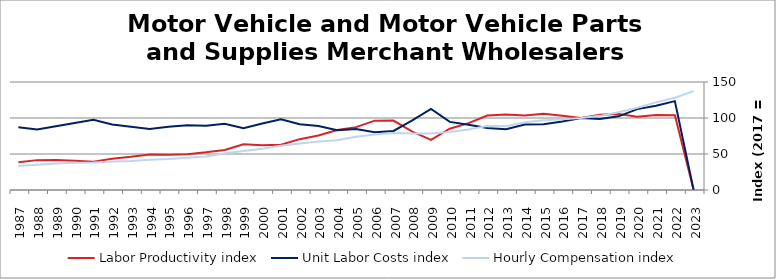
| Category | Labor Productivity index | Unit Labor Costs index | Hourly Compensation index |
|---|---|---|---|
| 2023.0 | 0 | 0 | 137.307 |
| 2022.0 | 103.831 | 123.4 | 128.127 |
| 2021.0 | 104.025 | 116.959 | 121.667 |
| 2020.0 | 101.749 | 112.314 | 114.278 |
| 2019.0 | 105.544 | 102.301 | 107.973 |
| 2018.0 | 104.469 | 98.562 | 102.967 |
| 2017.0 | 100 | 100 | 100 |
| 2016.0 | 103.191 | 95.053 | 98.087 |
| 2015.0 | 105.77 | 91.439 | 96.715 |
| 2014.0 | 103.376 | 90.913 | 93.982 |
| 2013.0 | 104.828 | 84.533 | 88.615 |
| 2012.0 | 103.49 | 86.016 | 89.018 |
| 2011.0 | 92.895 | 90.523 | 84.091 |
| 2010.0 | 85.141 | 94.599 | 80.542 |
| 2009.0 | 69.546 | 112.708 | 78.384 |
| 2008.0 | 81.166 | 96.81 | 78.577 |
| 2007.0 | 96.484 | 82.031 | 79.147 |
| 2006.0 | 96.301 | 80.208 | 77.241 |
| 2005.0 | 87.317 | 84.845 | 74.084 |
| 2004.0 | 83.238 | 82.923 | 69.023 |
| 2003.0 | 75.73 | 88.934 | 67.35 |
| 2002.0 | 70.61 | 91.418 | 64.55 |
| 2001.0 | 62.739 | 98.188 | 61.602 |
| 2000.0 | 62.047 | 92.404 | 57.334 |
| 1999.0 | 63.379 | 85.719 | 54.328 |
| 1998.0 | 55.652 | 91.838 | 51.11 |
| 1997.0 | 52.346 | 89.127 | 46.655 |
| 1996.0 | 49.804 | 89.882 | 44.765 |
| 1995.0 | 48.954 | 87.846 | 43.004 |
| 1994.0 | 49.41 | 84.841 | 41.92 |
| 1993.0 | 46.097 | 87.693 | 40.424 |
| 1992.0 | 43.556 | 90.869 | 39.579 |
| 1991.0 | 39.241 | 97.432 | 38.233 |
| 1990.0 | 40.57 | 93.031 | 37.743 |
| 1989.0 | 41.542 | 88.54 | 36.781 |
| 1988.0 | 41.486 | 84.13 | 34.902 |
| 1987.0 | 38.387 | 87.206 | 33.475 |